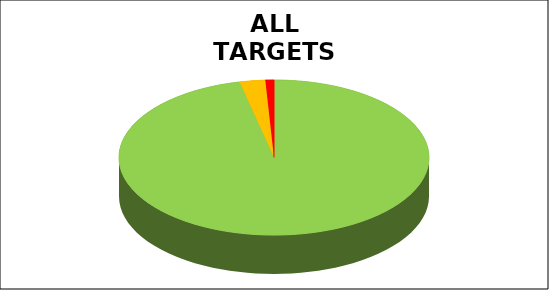
| Category | Series 0 |
|---|---|
| Green | 0.964 |
| Amber | 0.027 |
| Red | 0.009 |